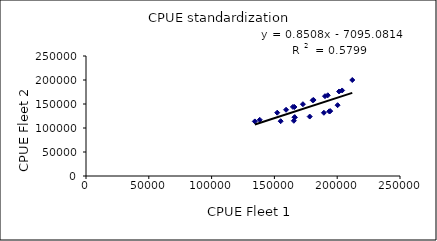
| Category | Series 0 |
|---|---|
| 211984.46751343118 | 200000 |
| 203941.74762444 | 178204.716 |
| 181197.5975018364 | 158330.831 |
| 180484.23949054274 | 157707.498 |
| 190278.62425276998 | 166265.851 |
| 201504.0384343039 | 176074.641 |
| 192485.05202989336 | 168193.832 |
| 164735.7908151561 | 143946.471 |
| 172710.07071777098 | 149607.598 |
| 159282.04664139944 | 137975.767 |
| 165966.7406681043 | 143766.286 |
| 152244.55700606518 | 131879.643 |
| 138326.39494556992 | 117033.594 |
| 134429.23095546002 | 113736.327 |
| 200304.0945177577 | 147533.047 |
| 166234.99182957484 | 122439.608 |
| 166073.86247042113 | 122320.929 |
| 154998.01933737483 | 114163.068 |
| 165472.05022906407 | 115063.183 |
| 178115.69025926437 | 123855.106 |
| 189413.33804311173 | 131711.075 |
| 193649.4749356073 | 134656.729 |
| 194433.69628499637 | 135202.048 |